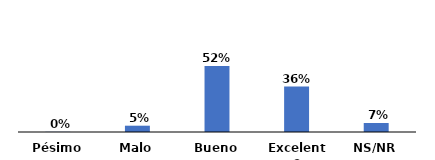
| Category | Series 0 |
|---|---|
| Pésimo | 0.002 |
| Malo | 0.05 |
| Bueno | 0.52 |
| Excelente | 0.358 |
| NS/NR | 0.071 |